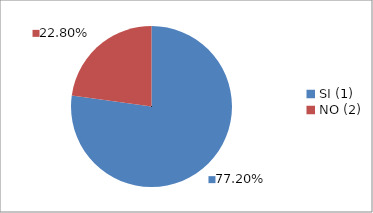
| Category | Series 0 |
|---|---|
| SI (1) | 0.772 |
| NO (2) | 0.228 |